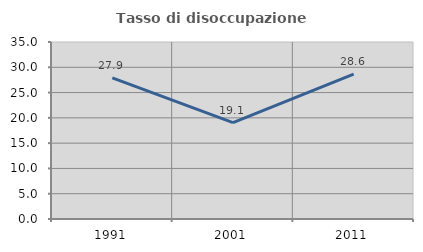
| Category | Tasso di disoccupazione giovanile  |
|---|---|
| 1991.0 | 27.899 |
| 2001.0 | 19.056 |
| 2011.0 | 28.643 |